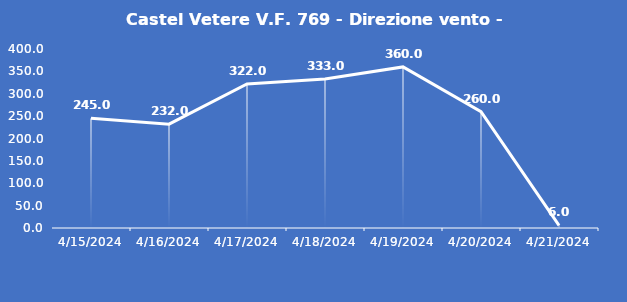
| Category | Castel Vetere V.F. 769 - Direzione vento - Grezzo (°N) |
|---|---|
| 4/15/24 | 245 |
| 4/16/24 | 232 |
| 4/17/24 | 322 |
| 4/18/24 | 333 |
| 4/19/24 | 360 |
| 4/20/24 | 260 |
| 4/21/24 | 6 |